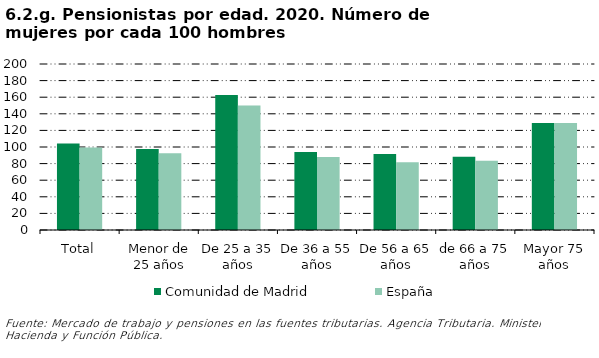
| Category | Comunidad de Madrid | España |
|---|---|---|
| Total | 104.201 | 99.528 |
| Menor de 25 años | 97.526 | 92.502 |
| De 25 a 35 años | 162.762 | 149.921 |
| De 36 a 55 años | 93.867 | 88.057 |
| De 56 a 65 años | 91.457 | 81.678 |
| de 66 a 75 años | 88.184 | 83.497 |
| Mayor 75 años | 129.017 | 128.904 |